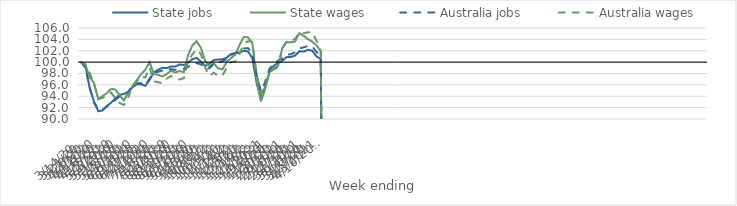
| Category | State jobs | State wages | Australia jobs | Australia wages |
|---|---|---|---|---|
| 14/03/2020 | 100 | 100 | 100 | 100 |
| 21/03/2020 | 99.321 | 99.565 | 98.969 | 99.607 |
| 28/03/2020 | 95.462 | 97.363 | 95.465 | 98.096 |
| 04/04/2020 | 93.062 | 96.333 | 92.926 | 96.24 |
| 11/04/2020 | 91.363 | 93.498 | 91.665 | 93.491 |
| 18/04/2020 | 91.493 | 94.044 | 91.648 | 93.698 |
| 25/04/2020 | 92.276 | 94.535 | 92.178 | 94.112 |
| 02/05/2020 | 92.87 | 95.335 | 92.676 | 94.658 |
| 09/05/2020 | 93.627 | 95.167 | 93.362 | 93.579 |
| 16/05/2020 | 94.239 | 94.153 | 93.954 | 92.815 |
| 23/05/2020 | 94.42 | 93.274 | 94.309 | 92.466 |
| 30/05/2020 | 94.7 | 94.672 | 94.816 | 93.79 |
| 06/06/2020 | 95.555 | 95.817 | 95.798 | 95.927 |
| 13/06/2020 | 96.108 | 96.823 | 96.298 | 96.601 |
| 20/06/2020 | 96.084 | 97.888 | 96.313 | 97.572 |
| 27/06/2020 | 95.833 | 98.65 | 95.913 | 97.302 |
| 04/07/2020 | 96.884 | 99.989 | 97.122 | 99.043 |
| 11/07/2020 | 98.188 | 97.942 | 98.196 | 96.625 |
| 18/07/2020 | 98.662 | 97.735 | 98.298 | 96.459 |
| 25/07/2020 | 99.013 | 97.488 | 98.521 | 96.266 |
| 01/08/2020 | 98.947 | 97.878 | 98.741 | 97.104 |
| 08/08/2020 | 99.244 | 98.51 | 98.74 | 97.565 |
| 15/08/2020 | 99.213 | 98.164 | 98.647 | 97.073 |
| 22/08/2020 | 99.588 | 98.43 | 98.71 | 96.935 |
| 29/08/2020 | 99.498 | 98.254 | 98.849 | 97.171 |
| 05/09/2020 | 99.899 | 101.286 | 99.156 | 100.217 |
| 12/09/2020 | 100.535 | 102.922 | 99.633 | 101.376 |
| 19/09/2020 | 100.747 | 103.689 | 99.824 | 102.277 |
| 26/09/2020 | 100.075 | 102.5 | 99.608 | 101.388 |
| 03/10/2020 | 99.332 | 100.17 | 98.809 | 99.006 |
| 10/10/2020 | 99.715 | 99.243 | 98.937 | 97.561 |
| 17/10/2020 | 100.371 | 99.798 | 99.695 | 98.146 |
| 24/10/2020 | 100.47 | 98.922 | 99.968 | 97.574 |
| 31/10/2020 | 100.488 | 98.707 | 100.149 | 97.618 |
| 07/11/2020 | 100.765 | 100.006 | 100.524 | 99.008 |
| 14/11/2020 | 101.419 | 100.707 | 101.259 | 100.027 |
| 21/11/2020 | 101.56 | 101.313 | 101.568 | 100.07 |
| 28/11/2020 | 101.683 | 102.944 | 101.862 | 101.42 |
| 05/12/2020 | 101.991 | 104.43 | 102.408 | 103.225 |
| 12/12/2020 | 101.871 | 104.345 | 102.467 | 103.683 |
| 19/12/2020 | 100.728 | 103.387 | 101.656 | 103.548 |
| 26/12/2020 | 96.38 | 96.929 | 97.85 | 98.062 |
| 02/01/2021 | 93.53 | 93.126 | 94.918 | 94.494 |
| 09/01/2021 | 95.66 | 95.342 | 96.496 | 95.843 |
| 16/01/2021 | 98.223 | 98.193 | 98.804 | 98.169 |
| 23/01/2021 | 99.355 | 99.012 | 99.699 | 98.726 |
| 30/01/2021 | 99.831 | 99.283 | 100.239 | 99.021 |
| 06/02/2021 | 100.209 | 102.44 | 100.616 | 102.406 |
| 13/02/2021 | 100.874 | 103.519 | 101.287 | 103.616 |
| 20/02/2021 | 100.905 | 103.501 | 101.379 | 103.698 |
| 27/02/2021 | 101.161 | 103.592 | 101.729 | 104.114 |
| 06/03/2021 | 101.911 | 105.093 | 102.416 | 105.202 |
| 13/03/2021 | 101.85 | 104.62 | 102.596 | 105.075 |
| 20/03/2021 | 102.163 | 104.056 | 102.84 | 105.243 |
| 27/03/2021 | 102.021 | 103.6 | 102.789 | 105.282 |
| 03/04/2021 | 100.998 | 102.952 | 101.804 | 103.78 |
| 10/04/2021 | 100.579 | 101.91 | 100.982 | 101.976 |